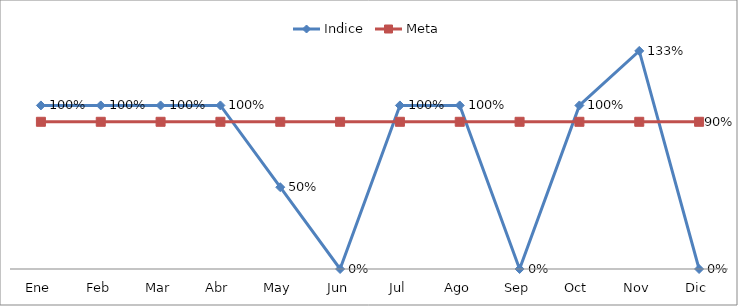
| Category | Indice | Meta |
|---|---|---|
| Ene | 1 | 0.9 |
| Feb | 1 | 0.9 |
| Mar | 1 | 0.9 |
| Abr | 1 | 0.9 |
| May | 0.5 | 0.9 |
| Jun | 0 | 0.9 |
| Jul | 1 | 0.9 |
| Ago | 1 | 0.9 |
| Sep | 0 | 0.9 |
| Oct | 1 | 0.9 |
| Nov | 1.333 | 0.9 |
| Dic | 0 | 0.9 |